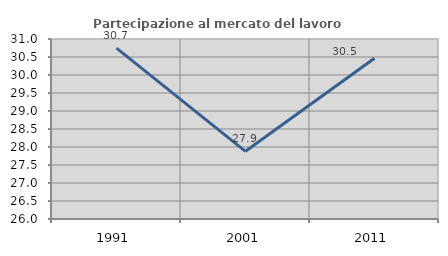
| Category | Partecipazione al mercato del lavoro  femminile |
|---|---|
| 1991.0 | 30.747 |
| 2001.0 | 27.88 |
| 2011.0 | 30.466 |